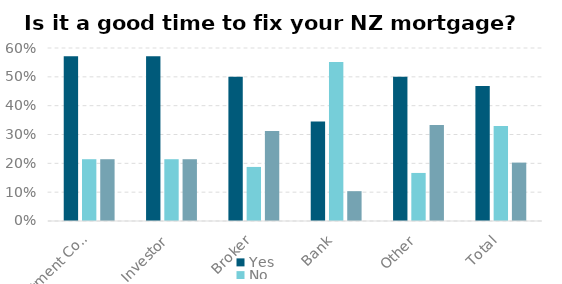
| Category | Yes | No | Indifferent |
|---|---|---|---|
| Investment Consultant | 0.571 | 0.214 | 0.214 |
| Investor | 0.571 | 0.214 | 0.214 |
| Broker | 0.5 | 0.188 | 0.312 |
| Bank | 0.345 | 0.552 | 0.103 |
| Other | 0.5 | 0.167 | 0.333 |
| Total | 0.468 | 0.329 | 0.203 |